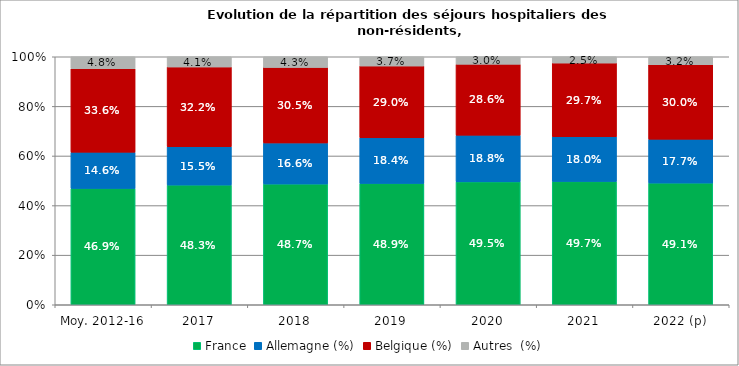
| Category | France | Allemagne (%) | Belgique (%) | Autres  (%) |
|---|---|---|---|---|
| Moy. 2012-16 | 0.469 | 0.146 | 0.336 | 0.048 |
| 2017 | 0.483 | 0.155 | 0.322 | 0.041 |
| 2018 | 0.487 | 0.166 | 0.305 | 0.043 |
| 2019 | 0.489 | 0.184 | 0.29 | 0.037 |
| 2020 | 0.495 | 0.188 | 0.286 | 0.03 |
| 2021 | 0.497 | 0.18 | 0.297 | 0.025 |
| 2022 (p) | 0.491 | 0.177 | 0.3 | 0.032 |